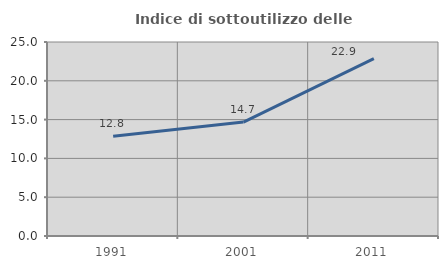
| Category | Indice di sottoutilizzo delle abitazioni  |
|---|---|
| 1991.0 | 12.84 |
| 2001.0 | 14.682 |
| 2011.0 | 22.866 |